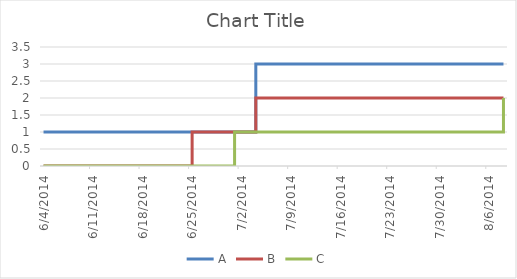
| Category | A | B | C |
|---|---|---|---|
| 6/4/14 | 1 | 0 | 0 |
| 6/25/14 | 1 | 0 | 0 |
| 6/25/14 | 1 | 1 | 0 |
| 7/1/14 | 1 | 1 | 0 |
| 7/1/14 | 1 | 1 | 1 |
| 7/4/14 | 1 | 1 | 1 |
| 7/4/14 | 3 | 2 | 1 |
| 8/8/14 | 3 | 2 | 1 |
| 8/8/14 | 3 | 2 | 2 |
| #N/A | 3 | 2 | 2 |
| #N/A | 0 | 0 | 0 |
| #N/A | 0 | 0 | 0 |
| #N/A | 0 | 0 | 0 |